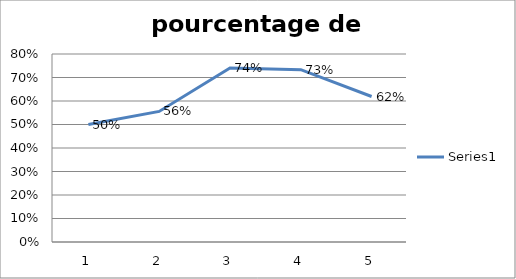
| Category | Series 0 |
|---|---|
| 0 | 0.5 |
| 1 | 0.556 |
| 2 | 0.741 |
| 3 | 0.733 |
| 4 | 0.619 |